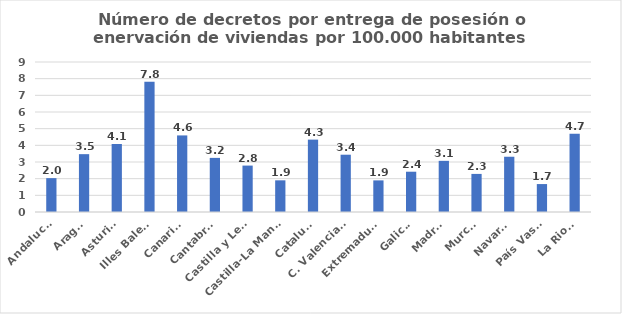
| Category | Numero de decretos por entrega de posesión o enervacion por 100.000 habitantes |
|---|---|
| Andalucía | 2.032 |
| Aragón | 3.471 |
| Asturias | 4.082 |
| Illes Balears | 7.821 |
| Canarias | 4.595 |
| Cantabria | 3.247 |
| Castilla y León | 2.785 |
| Castilla-La Mancha | 1.9 |
| Cataluña | 4.343 |
| C. Valenciana | 3.438 |
| Extremadura | 1.897 |
| Galicia | 2.417 |
| Madrid | 3.069 |
| Murcia | 2.285 |
| Navarra | 3.315 |
| País Vasco | 1.676 |
| La Rioja | 4.695 |